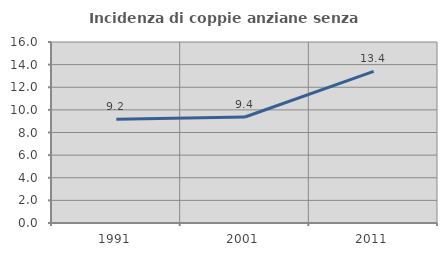
| Category | Incidenza di coppie anziane senza figli  |
|---|---|
| 1991.0 | 9.168 |
| 2001.0 | 9.371 |
| 2011.0 | 13.41 |